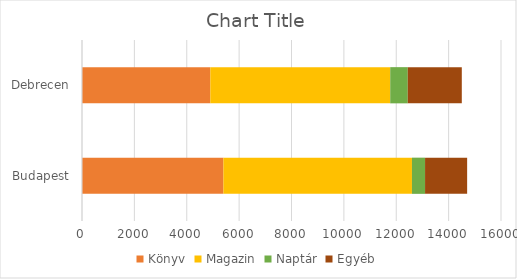
| Category | Könyv | Magazin | Naptár | Egyéb |
|---|---|---|---|---|
| Budapest | 5400 | 7200 | 500 | 1607 |
| Debrecen | 4900 | 6870 | 670 | 2063 |